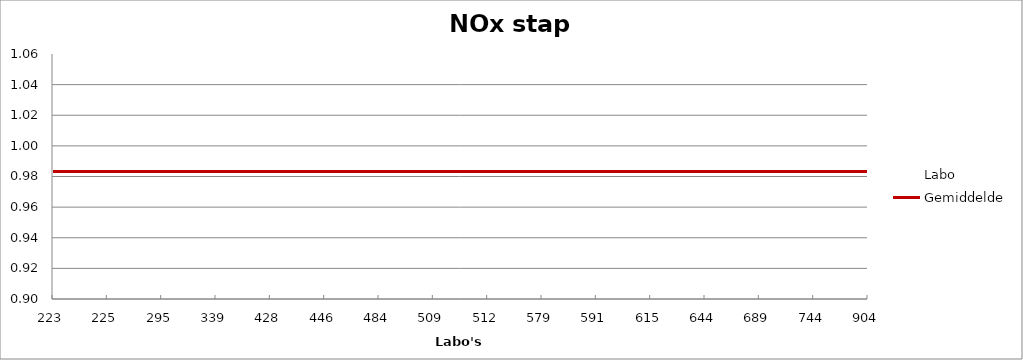
| Category | Labo | Gemiddelde |
|---|---|---|
| 223.0 | 1.034 | 0.983 |
| 225.0 | 0.966 | 0.983 |
| 295.0 | 1.034 | 0.983 |
| 339.0 | 0.974 | 0.983 |
| 428.0 | 1.006 | 0.983 |
| 446.0 | 0.984 | 0.983 |
| 484.0 | 0.974 | 0.983 |
| 509.0 | 0.976 | 0.983 |
| 512.0 | 0.977 | 0.983 |
| 579.0 | 0.99 | 0.983 |
| 591.0 | 0.943 | 0.983 |
| 615.0 | 0.988 | 0.983 |
| 644.0 | 1.021 | 0.983 |
| 689.0 | 0.929 | 0.983 |
| 744.0 | 0.973 | 0.983 |
| 904.0 | 0.962 | 0.983 |